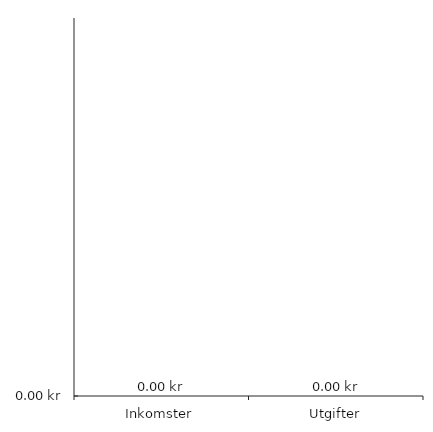
| Category | Diagramdata |
|---|---|
| 0 | 0 |
| 1 | 0 |